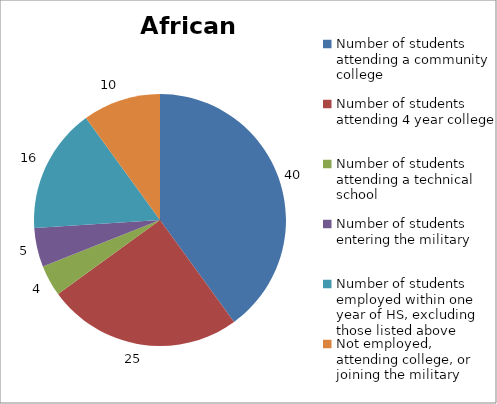
| Category | African American |
|---|---|
| Number of students attending a community college | 40 |
| Number of students attending 4 year college | 25 |
| Number of students attending a technical school | 4 |
| Number of students entering the military | 5 |
| Number of students employed within one year of HS, excluding those listed above | 16 |
| Not employed, attending college, or joining the military | 10 |